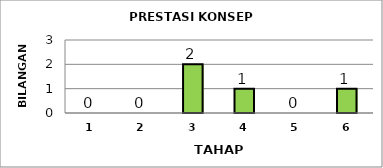
| Category | Series 0 |
|---|---|
| 1.0 | 0 |
| 2.0 | 0 |
| 3.0 | 2 |
| 4.0 | 1 |
| 5.0 | 0 |
| 6.0 | 1 |